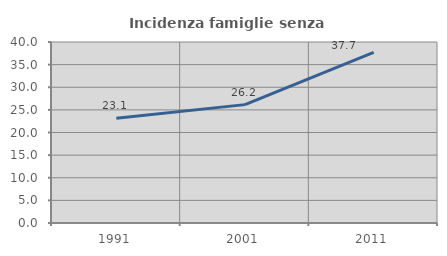
| Category | Incidenza famiglie senza nuclei |
|---|---|
| 1991.0 | 23.127 |
| 2001.0 | 26.158 |
| 2011.0 | 37.729 |